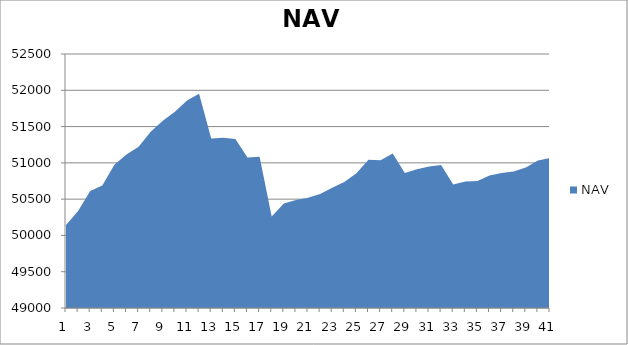
| Category | NAV |
|---|---|
| 0 | 50142.343 |
| 1 | 50336.57 |
| 2 | 50612.255 |
| 3 | 50687.913 |
| 4 | 50975.413 |
| 5 | 51115.874 |
| 6 | 51223.542 |
| 7 | 51427.364 |
| 8 | 51580.567 |
| 9 | 51704.692 |
| 10 | 51858.016 |
| 11 | 51951.766 |
| 12 | 51336.067 |
| 13 | 51345.356 |
| 14 | 51328.667 |
| 15 | 51072.985 |
| 16 | 51085.199 |
| 17 | 50261.67 |
| 18 | 50438.394 |
| 19 | 50489.896 |
| 20 | 50518.251 |
| 21 | 50572.468 |
| 22 | 50655.55 |
| 23 | 50737.787 |
| 24 | 50856.035 |
| 25 | 51041.806 |
| 26 | 51034.925 |
| 27 | 51128.589 |
| 28 | 50859.456 |
| 29 | 50911.137 |
| 30 | 50950.007 |
| 31 | 50970.175 |
| 32 | 50701.326 |
| 33 | 50743.495 |
| 34 | 50751.546 |
| 35 | 50826.725 |
| 36 | 50860.533 |
| 37 | 50879.283 |
| 38 | 50936.644 |
| 39 | 51031.381 |
| 40 | 51065.306 |